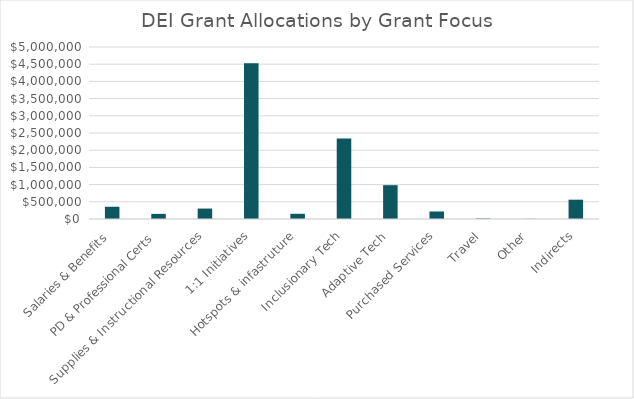
| Category | Series 0 |
|---|---|
| Salaries & Benefits | 356292 |
| PD & Professional Certs | 149203 |
| Supplies & Instructional Resources | 303290 |
| 1:1 Initiatives | 4528618 |
| Hotspots & infastruture | 151461 |
| Inclusionary Tech | 2342470 |
| Adaptive Tech | 983454 |
| Purchased Services | 218494 |
| Travel | 15000 |
| Other | 3847 |
| Indirects | 561765 |